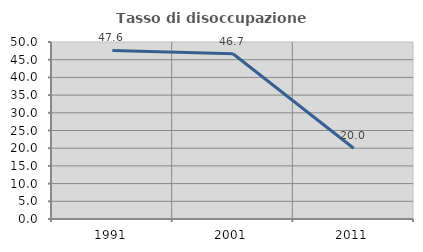
| Category | Tasso di disoccupazione giovanile  |
|---|---|
| 1991.0 | 47.619 |
| 2001.0 | 46.667 |
| 2011.0 | 20 |